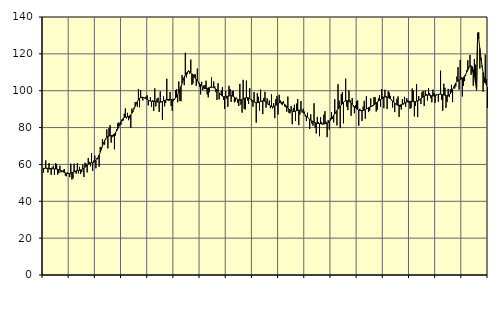
| Category | Piggar | Series 1 |
|---|---|---|
| nan | 55.6 | 57.93 |
| 87.0 | 57.6 | 57.86 |
| 87.0 | 62.2 | 57.98 |
| 87.0 | 57.6 | 57.95 |
| 87.0 | 55.6 | 57.9 |
| 87.0 | 60.7 | 57.84 |
| 87.0 | 57.2 | 57.78 |
| 87.0 | 54.4 | 57.74 |
| 87.0 | 58.4 | 57.69 |
| 87.0 | 59.3 | 57.63 |
| 87.0 | 54.3 | 57.58 |
| 87.0 | 60.7 | 57.54 |
| nan | 60.3 | 57.47 |
| 88.0 | 54.5 | 57.37 |
| 88.0 | 55.3 | 57.18 |
| 88.0 | 59.3 | 56.92 |
| 88.0 | 55.7 | 56.62 |
| 88.0 | 55.9 | 56.3 |
| 88.0 | 56.9 | 55.97 |
| 88.0 | 57.5 | 55.67 |
| 88.0 | 53.9 | 55.41 |
| 88.0 | 53.6 | 55.21 |
| 88.0 | 55.7 | 55.07 |
| 88.0 | 55.3 | 55.03 |
| nan | 53.1 | 55.09 |
| 89.0 | 60.4 | 55.24 |
| 89.0 | 51.8 | 55.49 |
| 89.0 | 52.4 | 55.79 |
| 89.0 | 60.4 | 56.07 |
| 89.0 | 55.7 | 56.32 |
| 89.0 | 55 | 56.52 |
| 89.0 | 60.7 | 56.66 |
| 89.0 | 55.1 | 56.76 |
| 89.0 | 58.7 | 56.86 |
| 89.0 | 54.9 | 57 |
| 89.0 | 55.8 | 57.22 |
| nan | 59.9 | 57.52 |
| 90.0 | 53.2 | 57.92 |
| 90.0 | 60.9 | 58.41 |
| 90.0 | 60.4 | 58.98 |
| 90.0 | 55.7 | 59.58 |
| 90.0 | 63.5 | 60.11 |
| 90.0 | 61.4 | 60.54 |
| 90.0 | 59 | 60.81 |
| 90.0 | 66.2 | 60.94 |
| 90.0 | 56.5 | 61.04 |
| 90.0 | 62.1 | 61.19 |
| 90.0 | 64.8 | 61.48 |
| nan | 57.9 | 62 |
| 91.0 | 63.4 | 62.8 |
| 91.0 | 63.3 | 63.86 |
| 91.0 | 58.8 | 65.16 |
| 91.0 | 69.5 | 66.67 |
| 91.0 | 69.3 | 68.3 |
| 91.0 | 73.7 | 69.96 |
| 91.0 | 71.8 | 71.55 |
| 91.0 | 70.7 | 72.95 |
| 91.0 | 73.5 | 74.04 |
| 91.0 | 79 | 74.8 |
| 91.0 | 68.7 | 75.22 |
| nan | 79.8 | 75.41 |
| 92.0 | 81.3 | 75.49 |
| 92.0 | 71.8 | 75.57 |
| 92.0 | 74.8 | 75.75 |
| 92.0 | 75.3 | 76.07 |
| 92.0 | 68.2 | 76.56 |
| 92.0 | 75.7 | 77.25 |
| 92.0 | 79.1 | 78.17 |
| 92.0 | 82.3 | 79.31 |
| 92.0 | 82.8 | 80.63 |
| 92.0 | 81.6 | 81.99 |
| 92.0 | 81.5 | 83.25 |
| nan | 83.4 | 84.3 |
| 93.0 | 83.8 | 85.02 |
| 93.0 | 87.5 | 85.44 |
| 93.0 | 90.4 | 85.65 |
| 93.0 | 85 | 85.73 |
| 93.0 | 88 | 85.81 |
| 93.0 | 84 | 86.02 |
| 93.0 | 85.1 | 86.38 |
| 93.0 | 79.8 | 86.96 |
| 93.0 | 90.3 | 87.8 |
| 93.0 | 88.4 | 88.89 |
| 93.0 | 90.9 | 90.18 |
| nan | 93.8 | 91.56 |
| 94.0 | 93.2 | 92.93 |
| 94.0 | 91.3 | 94.16 |
| 94.0 | 100.9 | 95.14 |
| 94.0 | 91 | 95.84 |
| 94.0 | 100.4 | 96.26 |
| 94.0 | 96 | 96.46 |
| 94.0 | 94.7 | 96.45 |
| 94.0 | 96.2 | 96.29 |
| 94.0 | 95.7 | 96.03 |
| 94.0 | 96.8 | 95.66 |
| 94.0 | 97.5 | 95.29 |
| nan | 92 | 94.92 |
| 95.0 | 94.7 | 94.59 |
| 95.0 | 96.5 | 94.37 |
| 95.0 | 91.3 | 94.26 |
| 95.0 | 94.8 | 94.22 |
| 95.0 | 89 | 94.24 |
| 95.0 | 101.3 | 94.2 |
| 95.0 | 91.5 | 94.11 |
| 95.0 | 95.7 | 93.98 |
| 95.0 | 96.2 | 93.84 |
| 95.0 | 88.5 | 93.74 |
| 95.0 | 99.7 | 93.75 |
| nan | 94.3 | 93.89 |
| 96.0 | 84.3 | 94.16 |
| 96.0 | 96.9 | 94.47 |
| 96.0 | 91.5 | 94.75 |
| 96.0 | 93.4 | 95.01 |
| 96.0 | 106.5 | 95.17 |
| 96.0 | 94.7 | 95.26 |
| 96.0 | 94.4 | 95.3 |
| 96.0 | 99.3 | 95.3 |
| 96.0 | 91.7 | 95.26 |
| 96.0 | 89.1 | 95.26 |
| 96.0 | 94.3 | 95.31 |
| nan | 95.1 | 95.48 |
| 97.0 | 100.4 | 95.93 |
| 97.0 | 100.9 | 96.71 |
| 97.0 | 93.7 | 97.8 |
| 97.0 | 105 | 99.14 |
| 97.0 | 94.4 | 100.66 |
| 97.0 | 94.3 | 102.31 |
| 97.0 | 108.5 | 104.05 |
| 97.0 | 106.4 | 105.75 |
| 97.0 | 103 | 107.32 |
| 97.0 | 120.6 | 108.65 |
| 97.0 | 107.2 | 109.66 |
| nan | 109 | 110.27 |
| 98.0 | 111 | 110.48 |
| 98.0 | 109.2 | 110.32 |
| 98.0 | 116.9 | 109.87 |
| 98.0 | 103.2 | 109.23 |
| 98.0 | 103.9 | 108.46 |
| 98.0 | 108.9 | 107.65 |
| 98.0 | 108.9 | 106.85 |
| 98.0 | 102.6 | 106.07 |
| 98.0 | 112 | 105.34 |
| 98.0 | 104 | 104.65 |
| 98.0 | 102.2 | 103.92 |
| nan | 98 | 103.22 |
| 99.0 | 104.8 | 102.55 |
| 99.0 | 100.3 | 101.93 |
| 99.0 | 102.9 | 101.44 |
| 99.0 | 103 | 101.16 |
| 99.0 | 105.4 | 101.12 |
| 99.0 | 98 | 101.25 |
| 99.0 | 96.4 | 101.48 |
| 99.0 | 99.2 | 101.71 |
| 99.0 | 102.2 | 101.85 |
| 99.0 | 107.2 | 101.87 |
| 99.0 | 101.8 | 101.81 |
| nan | 105 | 101.66 |
| 0.0 | 102.3 | 101.38 |
| 0.0 | 99.2 | 100.97 |
| 0.0 | 95 | 100.4 |
| 0.0 | 104.1 | 99.68 |
| 0.0 | 95.3 | 98.89 |
| 0.0 | 98.1 | 98.14 |
| 0.0 | 100 | 97.52 |
| 0.0 | 102 | 97.08 |
| 0.0 | 95 | 96.83 |
| 0.0 | 90.2 | 96.74 |
| 0.0 | 99.9 | 96.77 |
| nan | 95.7 | 96.91 |
| 1.0 | 91.3 | 97.05 |
| 1.0 | 102.7 | 97.18 |
| 1.0 | 100.9 | 97.29 |
| 1.0 | 93.9 | 97.28 |
| 1.0 | 99.9 | 97.14 |
| 1.0 | 99.9 | 96.91 |
| 1.0 | 93.7 | 96.53 |
| 1.0 | 94.2 | 96.06 |
| 1.0 | 96.2 | 95.6 |
| 1.0 | 93.3 | 95.23 |
| 1.0 | 91.7 | 95 |
| nan | 103.7 | 94.92 |
| 2.0 | 92.4 | 95.03 |
| 2.0 | 88.1 | 95.25 |
| 2.0 | 105.9 | 95.51 |
| 2.0 | 90.2 | 95.81 |
| 2.0 | 89.8 | 96.09 |
| 2.0 | 105.5 | 96.23 |
| 2.0 | 94.7 | 96.24 |
| 2.0 | 92.8 | 96.1 |
| 2.0 | 101.4 | 95.79 |
| 2.0 | 95.1 | 95.4 |
| 2.0 | 94.2 | 94.96 |
| nan | 91.3 | 94.49 |
| 3.0 | 99.3 | 94.04 |
| 3.0 | 93.4 | 93.72 |
| 3.0 | 82.7 | 93.54 |
| 3.0 | 98.7 | 93.49 |
| 3.0 | 96.7 | 93.61 |
| 3.0 | 89.2 | 93.84 |
| 3.0 | 100.6 | 94.11 |
| 3.0 | 94.5 | 94.35 |
| 3.0 | 87.3 | 94.51 |
| 3.0 | 96.1 | 94.5 |
| 3.0 | 99.4 | 94.29 |
| nan | 90.8 | 93.91 |
| 4.0 | 95.9 | 93.39 |
| 4.0 | 92.3 | 92.78 |
| 4.0 | 94.7 | 92.21 |
| 4.0 | 90.5 | 91.76 |
| 4.0 | 98 | 91.42 |
| 4.0 | 90.4 | 91.26 |
| 4.0 | 93.2 | 91.32 |
| 4.0 | 85.1 | 91.58 |
| 4.0 | 95.4 | 92 |
| 4.0 | 97 | 92.51 |
| 4.0 | 87.1 | 93.01 |
| nan | 97.8 | 93.41 |
| 5.0 | 94.8 | 93.69 |
| 5.0 | 92.7 | 93.77 |
| 5.0 | 92.2 | 93.63 |
| 5.0 | 94.4 | 93.27 |
| 5.0 | 91.5 | 92.75 |
| 5.0 | 91.1 | 92.07 |
| 5.0 | 88.6 | 91.34 |
| 5.0 | 96.8 | 90.66 |
| 5.0 | 88 | 90.05 |
| 5.0 | 87.7 | 89.53 |
| 5.0 | 91.7 | 89.12 |
| nan | 81.8 | 88.86 |
| 6.0 | 90.5 | 88.74 |
| 6.0 | 92.4 | 88.77 |
| 6.0 | 83.6 | 88.93 |
| 6.0 | 93 | 89.13 |
| 6.0 | 95.5 | 89.33 |
| 6.0 | 81.3 | 89.45 |
| 6.0 | 87 | 89.45 |
| 6.0 | 94.4 | 89.27 |
| 6.0 | 88.2 | 88.85 |
| 6.0 | 90.2 | 88.27 |
| 6.0 | 88.7 | 87.61 |
| nan | 86 | 86.91 |
| 7.0 | 83.5 | 86.22 |
| 7.0 | 88.1 | 85.58 |
| 7.0 | 84.9 | 85 |
| 7.0 | 79.2 | 84.48 |
| 7.0 | 87.2 | 84.01 |
| 7.0 | 82.2 | 83.62 |
| 7.0 | 81 | 83.29 |
| 7.0 | 93.2 | 82.97 |
| 7.0 | 79.9 | 82.68 |
| 7.0 | 76.8 | 82.45 |
| 7.0 | 85.8 | 82.29 |
| nan | 83 | 82.19 |
| 8.0 | 75.3 | 82.11 |
| 8.0 | 85.7 | 82.05 |
| 8.0 | 82.9 | 82.01 |
| 8.0 | 81.6 | 81.99 |
| 8.0 | 87 | 81.99 |
| 8.0 | 88.9 | 82.04 |
| 8.0 | 83.2 | 82.17 |
| 8.0 | 74.8 | 82.37 |
| 8.0 | 84.1 | 82.71 |
| 8.0 | 78.9 | 83.24 |
| 8.0 | 85.2 | 83.92 |
| nan | 88.3 | 84.73 |
| 9.0 | 84.8 | 85.69 |
| 9.0 | 82.8 | 86.66 |
| 9.0 | 95.4 | 87.58 |
| 9.0 | 87.6 | 88.46 |
| 9.0 | 81.2 | 89.27 |
| 9.0 | 103.5 | 90.01 |
| 9.0 | 94.6 | 90.73 |
| 9.0 | 79.7 | 91.49 |
| 9.0 | 98.3 | 92.27 |
| 9.0 | 99.2 | 93.04 |
| 9.0 | 82.3 | 93.74 |
| nan | 94.1 | 94.26 |
| 10.0 | 106.5 | 94.54 |
| 10.0 | 91.3 | 94.63 |
| 10.0 | 89.5 | 94.52 |
| 10.0 | 100.2 | 94.21 |
| 10.0 | 95 | 93.79 |
| 10.0 | 86.4 | 93.29 |
| 10.0 | 96 | 92.66 |
| 10.0 | 91.3 | 92.01 |
| 10.0 | 87.8 | 91.35 |
| 10.0 | 92.2 | 90.69 |
| 10.0 | 94.3 | 90.12 |
| nan | 94.7 | 89.7 |
| 11.0 | 81 | 89.4 |
| 11.0 | 90.2 | 89.21 |
| 11.0 | 89.5 | 89.17 |
| 11.0 | 83.6 | 89.22 |
| 11.0 | 91.4 | 89.31 |
| 11.0 | 94.5 | 89.49 |
| 11.0 | 84.8 | 89.78 |
| 11.0 | 97 | 90.11 |
| 11.0 | 90.3 | 90.47 |
| 11.0 | 88.4 | 90.81 |
| 11.0 | 89.2 | 91.09 |
| nan | 95.8 | 91.31 |
| 12.0 | 91.8 | 91.57 |
| 12.0 | 91.6 | 91.92 |
| 12.0 | 96.6 | 92.32 |
| 12.0 | 96.5 | 92.82 |
| 12.0 | 88.7 | 93.37 |
| 12.0 | 89.6 | 93.89 |
| 12.0 | 95.8 | 94.36 |
| 12.0 | 97.5 | 94.79 |
| 12.0 | 91.3 | 95.18 |
| 12.0 | 100.9 | 95.56 |
| 12.0 | 97 | 95.96 |
| nan | 90.5 | 96.31 |
| 13.0 | 100.5 | 96.56 |
| 13.0 | 97.1 | 96.63 |
| 13.0 | 90.1 | 96.53 |
| 13.0 | 99.7 | 96.29 |
| 13.0 | 99 | 95.96 |
| 13.0 | 97.2 | 95.56 |
| 13.0 | 94.7 | 95.07 |
| 13.0 | 90.9 | 94.49 |
| 13.0 | 96.9 | 93.87 |
| 13.0 | 88.4 | 93.26 |
| 13.0 | 93 | 92.7 |
| nan | 95.6 | 92.29 |
| 14.0 | 96.9 | 92.08 |
| 14.0 | 85.8 | 92.07 |
| 14.0 | 91.2 | 92.22 |
| 14.0 | 89.8 | 92.44 |
| 14.0 | 95.5 | 92.69 |
| 14.0 | 92.5 | 92.99 |
| 14.0 | 96.7 | 93.27 |
| 14.0 | 91.3 | 93.56 |
| 14.0 | 96 | 93.82 |
| 14.0 | 94.9 | 94.03 |
| 14.0 | 93.4 | 94.17 |
| nan | 90.2 | 94.21 |
| 15.0 | 90.6 | 94.16 |
| 15.0 | 101.2 | 94.09 |
| 15.0 | 100.1 | 94.07 |
| 15.0 | 86 | 94.1 |
| 15.0 | 91.8 | 94.2 |
| 15.0 | 103.5 | 94.35 |
| 15.0 | 85.7 | 94.55 |
| 15.0 | 97.1 | 94.82 |
| 15.0 | 95.4 | 95.2 |
| 15.0 | 92.8 | 95.63 |
| 15.0 | 99.1 | 96.1 |
| nan | 99.9 | 96.59 |
| 16.0 | 91.7 | 97.04 |
| 16.0 | 100.1 | 97.39 |
| 16.0 | 98.2 | 97.59 |
| 16.0 | 94.7 | 97.69 |
| 16.0 | 101.4 | 97.66 |
| 16.0 | 98.6 | 97.5 |
| 16.0 | 95.9 | 97.33 |
| 16.0 | 93.7 | 97.23 |
| 16.0 | 100.6 | 97.17 |
| 16.0 | 98.8 | 97.21 |
| 16.0 | 93.4 | 97.37 |
| nan | 98.1 | 97.59 |
| 17.0 | 97.8 | 97.84 |
| 17.0 | 94 | 98.06 |
| 17.0 | 98 | 98.16 |
| 17.0 | 110.9 | 98.16 |
| 17.0 | 95.1 | 98.08 |
| 17.0 | 89.1 | 97.9 |
| 17.0 | 103.8 | 97.7 |
| 17.0 | 101.6 | 97.51 |
| 17.0 | 90.7 | 97.34 |
| 17.0 | 93.8 | 97.27 |
| 17.0 | 101 | 97.37 |
| nan | 96.5 | 97.72 |
| 18.0 | 100.8 | 98.38 |
| 18.0 | 103.2 | 99.38 |
| 18.0 | 93.8 | 100.61 |
| 18.0 | 102 | 101.91 |
| 18.0 | 101.2 | 103.14 |
| 18.0 | 102.3 | 104.21 |
| 18.0 | 107.7 | 105.02 |
| 18.0 | 112.8 | 105.5 |
| 18.0 | 100.6 | 105.79 |
| 18.0 | 116.7 | 106.04 |
| 18.0 | 107.4 | 106.35 |
| nan | 96.9 | 106.76 |
| 19.0 | 102.6 | 107.29 |
| 19.0 | 105.2 | 107.99 |
| 19.0 | 107.9 | 108.91 |
| 19.0 | 111.1 | 110.03 |
| 19.0 | 116.5 | 111.29 |
| 19.0 | 113.1 | 112.49 |
| 19.0 | 119.4 | 113.35 |
| 19.0 | 108.6 | 113.6 |
| 19.0 | 109.9 | 113.01 |
| 19.0 | 102.7 | 111.34 |
| 19.0 | 117.2 | 108.52 |
| nan | 114.1 | 104.76 |
| 20.0 | 103.5 | 100.28 |
| 20.0 | 131.5 | 130.46 |
| 20.0 | 131.7 | 128.17 |
| 20.0 | 112 | 122.97 |
| 20.0 | 116.5 | 118 |
| 20.0 | 112.8 | 113.6 |
| 20.0 | 99.5 | 109.89 |
| 20.0 | 104.2 | 106.95 |
| 20.0 | 119.6 | 104.78 |
| 20.0 | 106.3 | 103.23 |
| 20.0 | 90.7 | 102.05 |